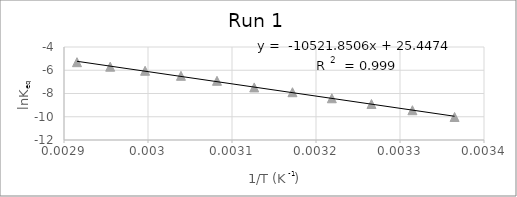
| Category | Series 2 |
|---|---|
| 0.003364963994885255 | -10.021 |
| 0.003314770617873243 | -9.439 |
| 0.0032660526487686982 | -8.904 |
| 0.0032188495831589788 | -8.411 |
| 0.003171985028230667 | -7.889 |
| 0.0031264655307175235 | -7.477 |
| 0.0030821390044691015 | -6.908 |
| 0.0030392365437802026 | -6.478 |
| 0.002996524032122737 | -6.044 |
| 0.002954995419757099 | -5.695 |
| 0.0029154518950437317 | -5.305 |